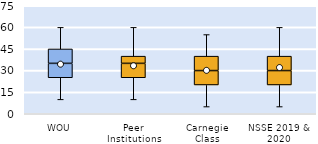
| Category | 25th | 50th | 75th |
|---|---|---|---|
| WOU | 25 | 10 | 10 |
| Peer Institutions | 25 | 10 | 5 |
| Carnegie Class | 20 | 10 | 10 |
| NSSE 2019 & 2020 | 20 | 10 | 10 |